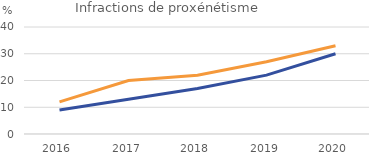
| Category | Part des victimes mineures française | Part des victimes mineures |
|---|---|---|
| 2016.0 | 9 | 12 |
| 2017.0 | 13 | 20 |
| 2018.0 | 17 | 22 |
| 2019.0 | 22 | 27 |
| 2020.0 | 30 | 33 |